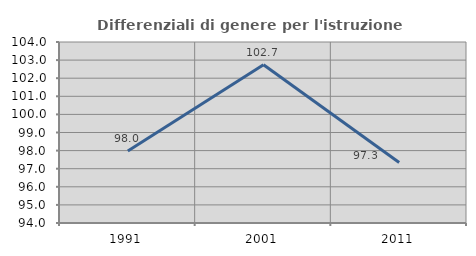
| Category | Differenziali di genere per l'istruzione superiore |
|---|---|
| 1991.0 | 97.976 |
| 2001.0 | 102.747 |
| 2011.0 | 97.339 |